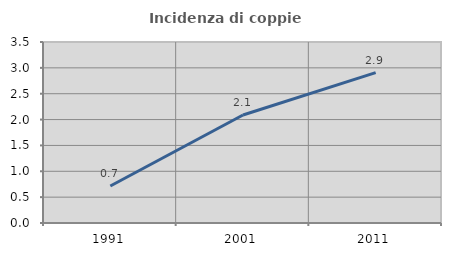
| Category | Incidenza di coppie miste |
|---|---|
| 1991.0 | 0.715 |
| 2001.0 | 2.089 |
| 2011.0 | 2.908 |